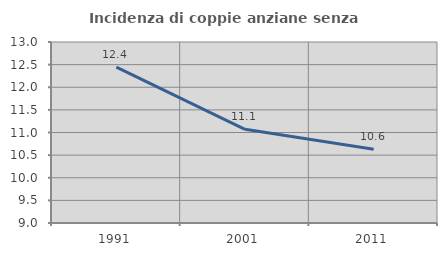
| Category | Incidenza di coppie anziane senza figli  |
|---|---|
| 1991.0 | 12.443 |
| 2001.0 | 11.071 |
| 2011.0 | 10.629 |